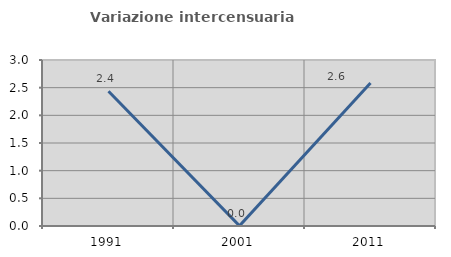
| Category | Variazione intercensuaria annua |
|---|---|
| 1991.0 | 2.435 |
| 2001.0 | 0.003 |
| 2011.0 | 2.584 |